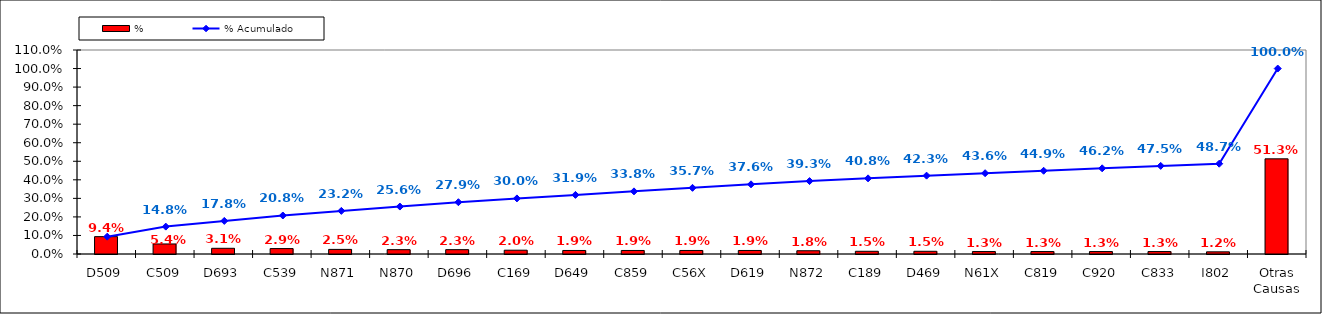
| Category | % |
|---|---|
| D509 | 0.094 |
| C509 | 0.054 |
| D693 | 0.031 |
| C539 | 0.029 |
| N871 | 0.025 |
| N870 | 0.023 |
| D696 | 0.023 |
| C169 | 0.02 |
| D649 | 0.019 |
| C859 | 0.019 |
| C56X | 0.019 |
| D619 | 0.019 |
| N872 | 0.018 |
| C189 | 0.015 |
| D469 | 0.015 |
| N61X | 0.013 |
| C819 | 0.013 |
| C920 | 0.013 |
| C833 | 0.013 |
| I802 | 0.012 |
| Otras Causas | 0.513 |